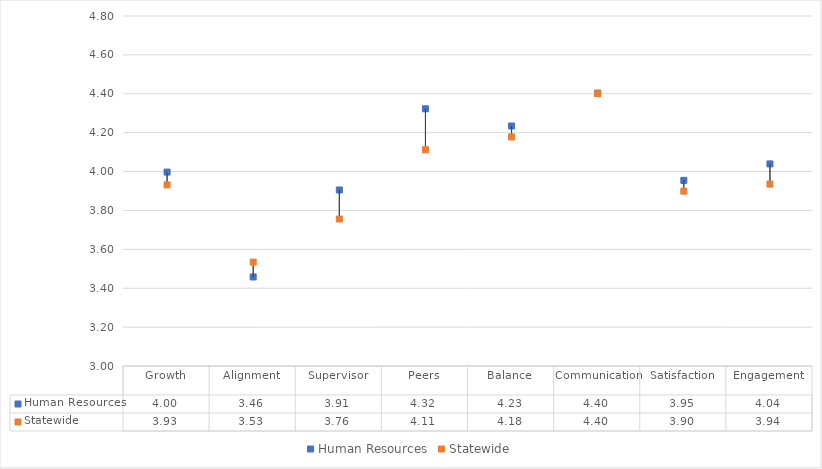
| Category | Human Resources | Statewide |
|---|---|---|
| Growth | 3.997 | 3.931 |
| Alignment | 3.458 | 3.534 |
| Supervisor | 3.905 | 3.756 |
| Peers | 4.323 | 4.112 |
| Balance | 4.234 | 4.178 |
| Communication | 4.404 | 4.4 |
| Satisfaction | 3.955 | 3.899 |
| Engagement | 4.039 | 3.936 |